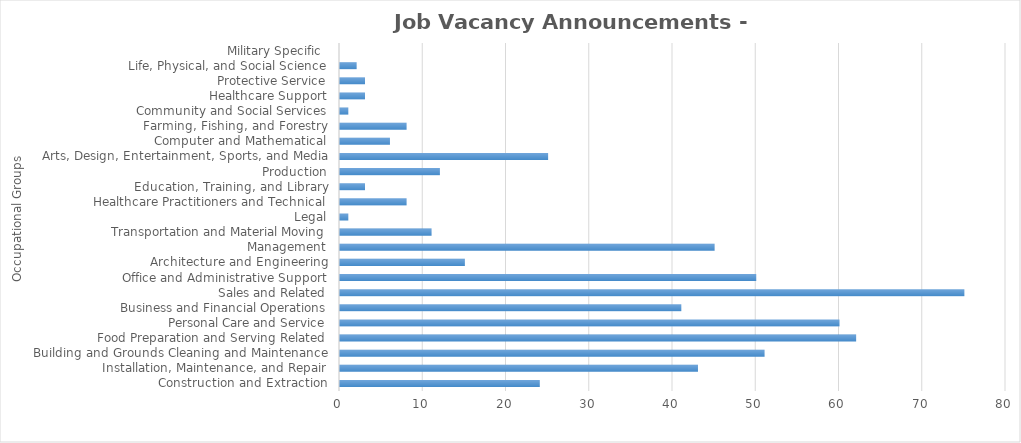
| Category | Total JVAs |
|---|---|
| Construction and Extraction | 24 |
| Installation, Maintenance, and Repair | 43 |
| Building and Grounds Cleaning and Maintenance | 51 |
| Food Preparation and Serving Related | 62 |
| Personal Care and Service | 60 |
| Business and Financial Operations | 41 |
| Sales and Related | 75 |
| Office and Administrative Support | 50 |
| Architecture and Engineering | 15 |
| Management | 45 |
| Transportation and Material Moving | 11 |
| Legal | 1 |
| Healthcare Practitioners and Technical | 8 |
| Education, Training, and Library | 3 |
| Production | 12 |
| Arts, Design, Entertainment, Sports, and Media | 25 |
| Computer and Mathematical | 6 |
| Farming, Fishing, and Forestry | 8 |
| Community and Social Services | 1 |
| Healthcare Support | 3 |
| Protective Service | 3 |
| Life, Physical, and Social Science | 2 |
| Military Specific  | 0 |